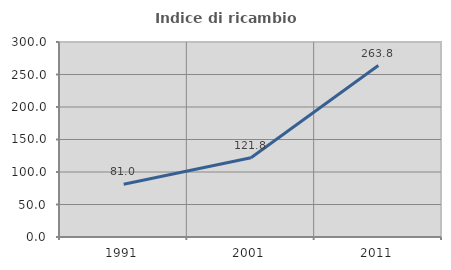
| Category | Indice di ricambio occupazionale  |
|---|---|
| 1991.0 | 81.022 |
| 2001.0 | 121.849 |
| 2011.0 | 263.797 |